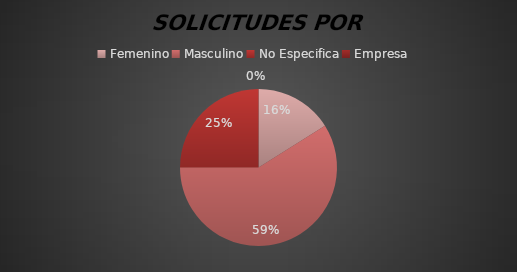
| Category | Series 0 |
|---|---|
| Femenino | 9 |
| Masculino | 33 |
| No Especifica | 14 |
| Empresa | 0 |